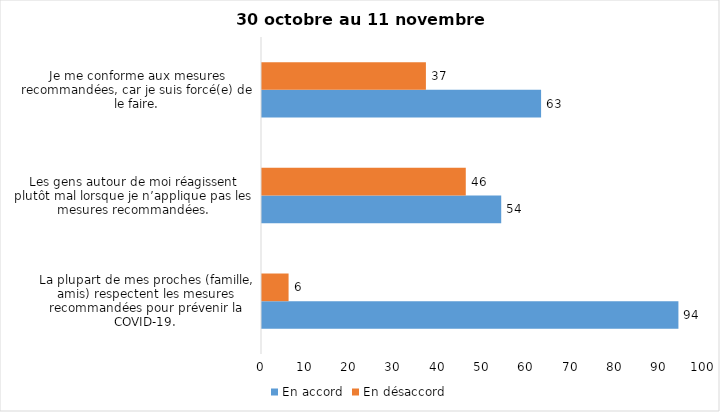
| Category | En accord | En désaccord |
|---|---|---|
| La plupart de mes proches (famille, amis) respectent les mesures recommandées pour prévenir la COVID-19. | 94 | 6 |
| Les gens autour de moi réagissent plutôt mal lorsque je n’applique pas les mesures recommandées. | 54 | 46 |
| Je me conforme aux mesures recommandées, car je suis forcé(e) de le faire. | 63 | 37 |